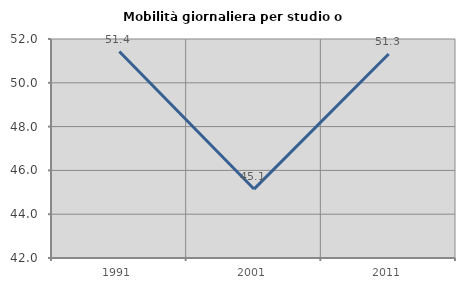
| Category | Mobilità giornaliera per studio o lavoro |
|---|---|
| 1991.0 | 51.429 |
| 2001.0 | 45.148 |
| 2011.0 | 51.313 |